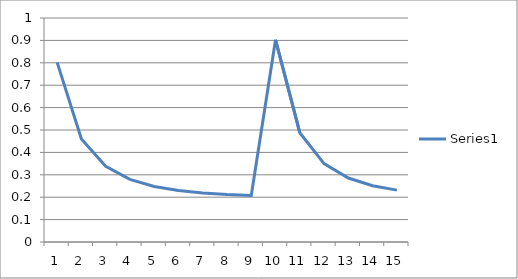
| Category | Series 0 |
|---|---|
| 0 | 0.802 |
| 1 | 0.46 |
| 2 | 0.338 |
| 3 | 0.279 |
| 4 | 0.248 |
| 5 | 0.229 |
| 6 | 0.218 |
| 7 | 0.212 |
| 8 | 0.207 |
| 9 | 0.903 |
| 10 | 0.488 |
| 11 | 0.35 |
| 12 | 0.286 |
| 13 | 0.251 |
| 14 | 0.232 |